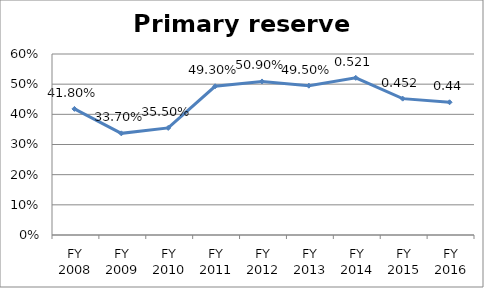
| Category | Primary reserve ratio |
|---|---|
| FY 2016 | 0.44 |
| FY 2015 | 0.452 |
| FY 2014 | 0.521 |
| FY 2013 | 0.495 |
| FY 2012 | 0.509 |
| FY 2011 | 0.493 |
| FY 2010 | 0.355 |
| FY 2009 | 0.337 |
| FY 2008 | 0.418 |